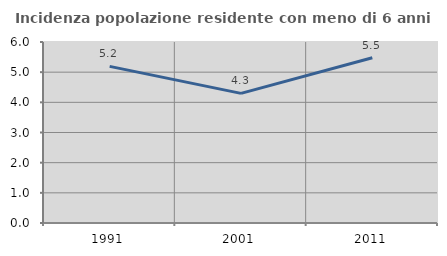
| Category | Incidenza popolazione residente con meno di 6 anni |
|---|---|
| 1991.0 | 5.191 |
| 2001.0 | 4.297 |
| 2011.0 | 5.477 |